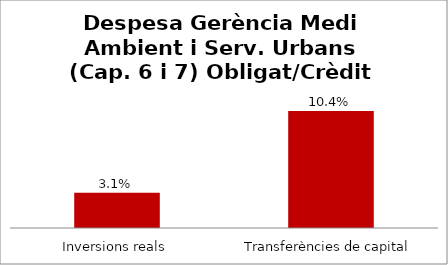
| Category | Series 0 |
|---|---|
| Inversions reals | 0.031 |
| Transferències de capital | 0.104 |